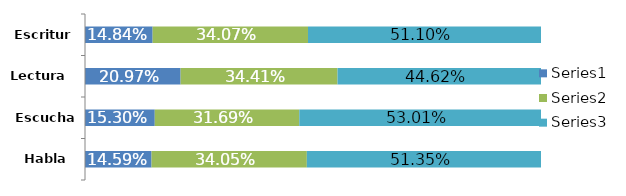
| Category | Series 0 | Series 1 | Series 2 |
|---|---|---|---|
| Habla | 0.146 | 0.341 | 0.514 |
| Escucha | 0.153 | 0.317 | 0.53 |
| Lectura | 0.21 | 0.344 | 0.446 |
| Escritura | 0.148 | 0.341 | 0.511 |